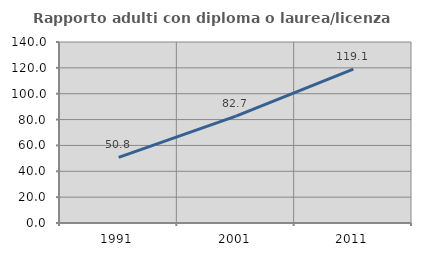
| Category | Rapporto adulti con diploma o laurea/licenza media  |
|---|---|
| 1991.0 | 50.776 |
| 2001.0 | 82.671 |
| 2011.0 | 119.09 |